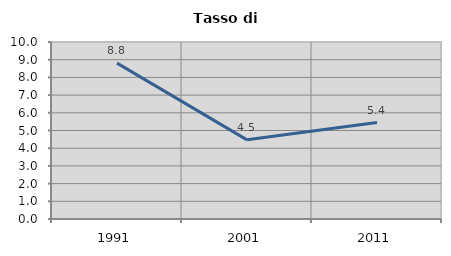
| Category | Tasso di disoccupazione   |
|---|---|
| 1991.0 | 8.806 |
| 2001.0 | 4.471 |
| 2011.0 | 5.449 |